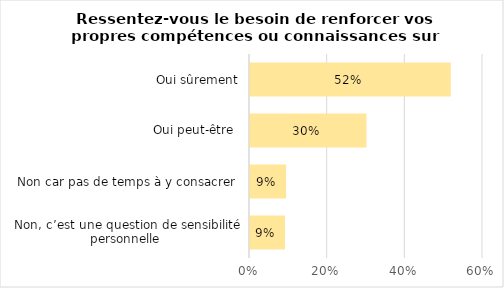
| Category | Series 0 |
|---|---|
| Non, c’est une question de sensibilité personnelle  | 0.09 |
| Non car pas de temps à y consacrer  | 0.093 |
| Oui peut-être  | 0.3 |
| Oui sûrement | 0.517 |